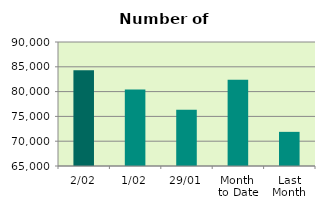
| Category | Series 0 |
|---|---|
| 2/02 | 84284 |
| 1/02 | 80444 |
| 29/01 | 76356 |
| Month 
to Date | 82364 |
| Last
Month | 71883.3 |